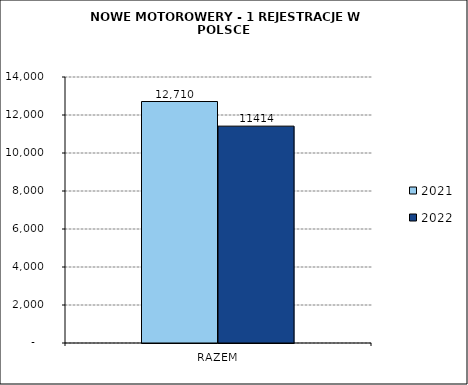
| Category | 2021 | 2022 |
|---|---|---|
| RAZEM | 12710 | 11414 |